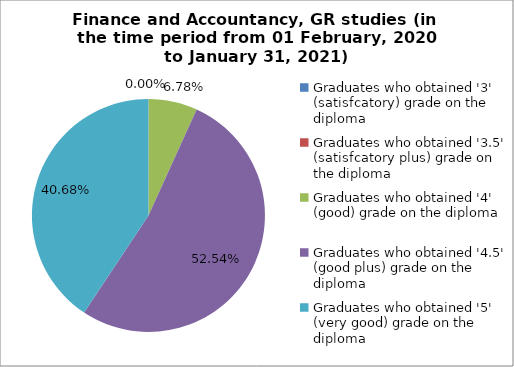
| Category | Series 0 |
|---|---|
| Graduates who obtained '3' (satisfcatory) grade on the diploma | 0 |
| Graduates who obtained '3.5' (satisfcatory plus) grade on the diploma | 0 |
| Graduates who obtained '4' (good) grade on the diploma | 6.78 |
| Graduates who obtained '4.5' (good plus) grade on the diploma | 52.542 |
| Graduates who obtained '5' (very good) grade on the diploma | 40.678 |